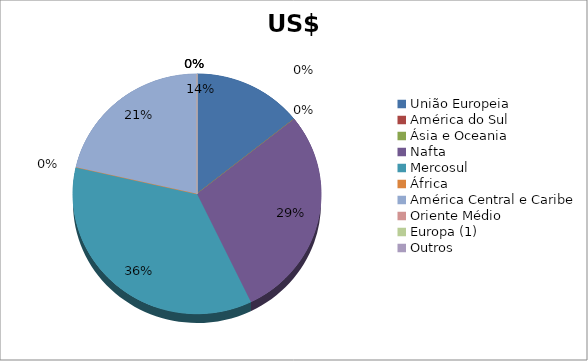
| Category | Series 0 |
|---|---|
| União Europeia | 2 |
| América do Sul | 0 |
| Ásia e Oceania | 0 |
| Nafta | 4 |
| Mercosul | 5 |
| África | 0 |
| América Central e Caribe | 3 |
| Oriente Médio | 0 |
| Europa (1) | 0 |
| Outros | 0 |